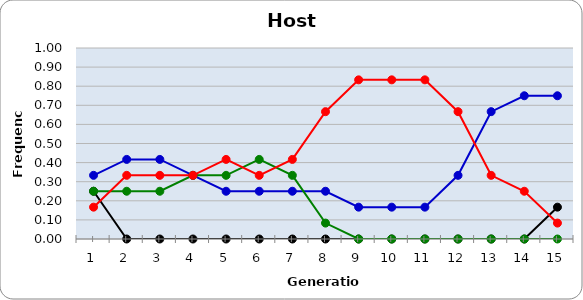
| Category | Sp | Cl | Di | He |
|---|---|---|---|---|
| 1.0 | 0.333 | 0.25 | 0.25 | 0.167 |
| 2.0 | 0.417 | 0 | 0.25 | 0.333 |
| 3.0 | 0.417 | 0 | 0.25 | 0.333 |
| 4.0 | 0.333 | 0 | 0.333 | 0.333 |
| 5.0 | 0.25 | 0 | 0.333 | 0.417 |
| 6.0 | 0.25 | 0 | 0.417 | 0.333 |
| 7.0 | 0.25 | 0 | 0.333 | 0.417 |
| 8.0 | 0.25 | 0 | 0.083 | 0.667 |
| 9.0 | 0.167 | 0 | 0 | 0.833 |
| 10.0 | 0.167 | 0 | 0 | 0.833 |
| 11.0 | 0.167 | 0 | 0 | 0.833 |
| 12.0 | 0.333 | 0 | 0 | 0.667 |
| 13.0 | 0.667 | 0 | 0 | 0.333 |
| 14.0 | 0.75 | 0 | 0 | 0.25 |
| 15.0 | 0.75 | 0.167 | 0 | 0.083 |